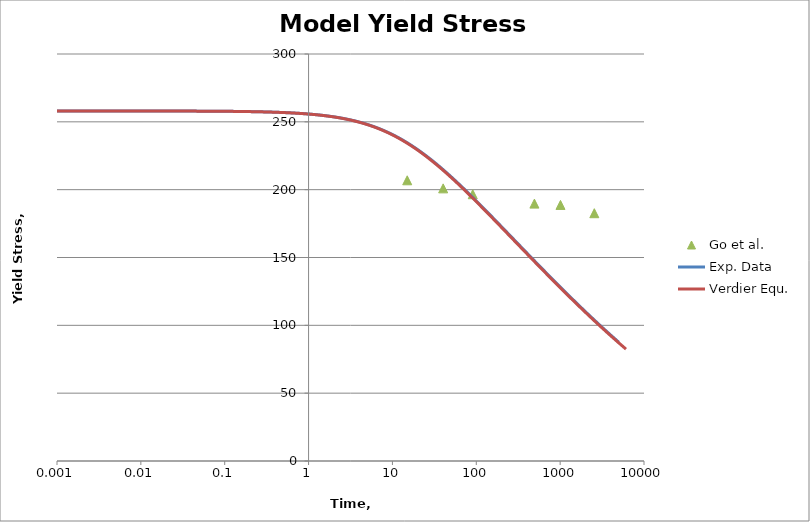
| Category | Go et al. |
|---|---|
| 0.0 | 258 |
| 15.012879542386322 | 206.907 |
| 40.273650789130926 | 200.964 |
| 90.77139294024566 | 196.626 |
| 493.4236936655811 | 189.719 |
| 1009.5550370813455 | 188.755 |
| 2555.524212115162 | 182.65 |